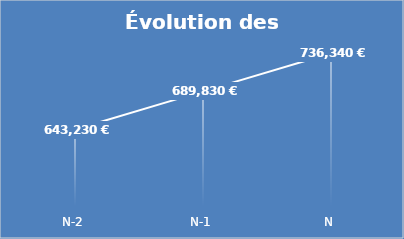
| Category | Totaux |
|---|---|
| N-2 | 643230 |
| N-1 | 689830 |
| N | 736340 |